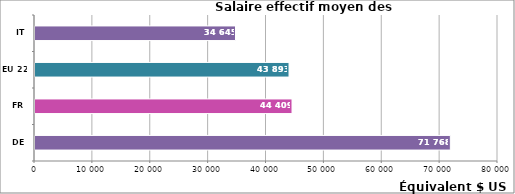
| Category | Series 0 |
|---|---|
| DE | 71767.757 |
| FR | 44409.01 |
| EU 22 | 43892.983 |
| IT | 34645.253 |